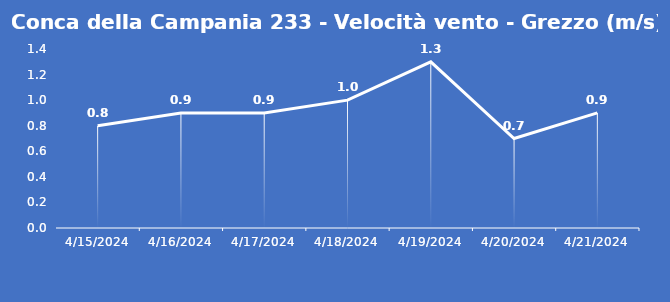
| Category | Conca della Campania 233 - Velocità vento - Grezzo (m/s) |
|---|---|
| 4/15/24 | 0.8 |
| 4/16/24 | 0.9 |
| 4/17/24 | 0.9 |
| 4/18/24 | 1 |
| 4/19/24 | 1.3 |
| 4/20/24 | 0.7 |
| 4/21/24 | 0.9 |